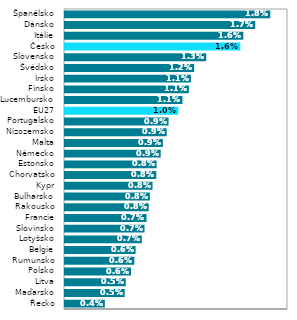
| Category | Series 0 |
|---|---|
| Řecko | 0.004 |
| Maďarsko | 0.005 |
| Litva | 0.005 |
| Polsko | 0.006 |
| Rumunsko | 0.006 |
| Belgie | 0.006 |
| Lotyšsko | 0.007 |
| Slovinsko | 0.007 |
| Francie | 0.007 |
| Rakousko | 0.008 |
| Bulharsko | 0.008 |
| Kypr | 0.008 |
| Chorvatsko | 0.008 |
| Estonsko | 0.008 |
| Německo | 0.009 |
| Malta | 0.009 |
| Nizozemsko | 0.009 |
| Portugalsko | 0.009 |
| EU27 | 0.01 |
| Lucembursko | 0.011 |
| Finsko | 0.011 |
| Irsko | 0.011 |
| Švédsko | 0.012 |
| Slovensko | 0.013 |
| Česko | 0.016 |
| Itálie | 0.016 |
| Dánsko | 0.017 |
| Španělsko | 0.018 |